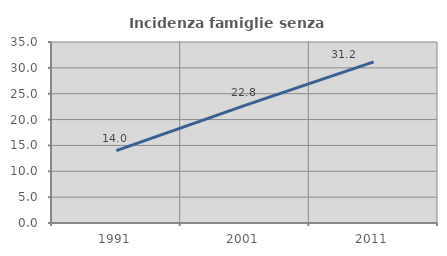
| Category | Incidenza famiglie senza nuclei |
|---|---|
| 1991.0 | 13.993 |
| 2001.0 | 22.76 |
| 2011.0 | 31.154 |